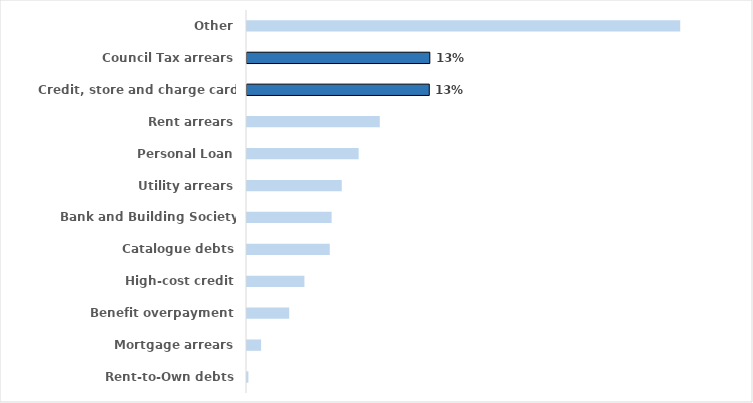
| Category | 2019/20 |
|---|---|
| Other | 0.305 |
| Council Tax arrears | 0.129 |
| Credit, store and charge card debts | 0.128 |
| Rent arrears | 0.094 |
| Personal Loan | 0.079 |
| Utility arrears | 0.067 |
| Bank and Building Society overdrafts | 0.06 |
| Catalogue debts | 0.058 |
| High-cost credit | 0.04 |
| Benefit overpayment | 0.03 |
| Mortgage arrears | 0.01 |
| Rent-to-Own debts | 0.001 |